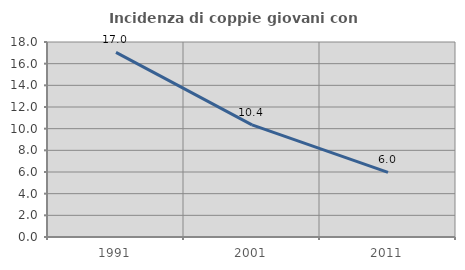
| Category | Incidenza di coppie giovani con figli |
|---|---|
| 1991.0 | 17.04 |
| 2001.0 | 10.355 |
| 2011.0 | 5.97 |